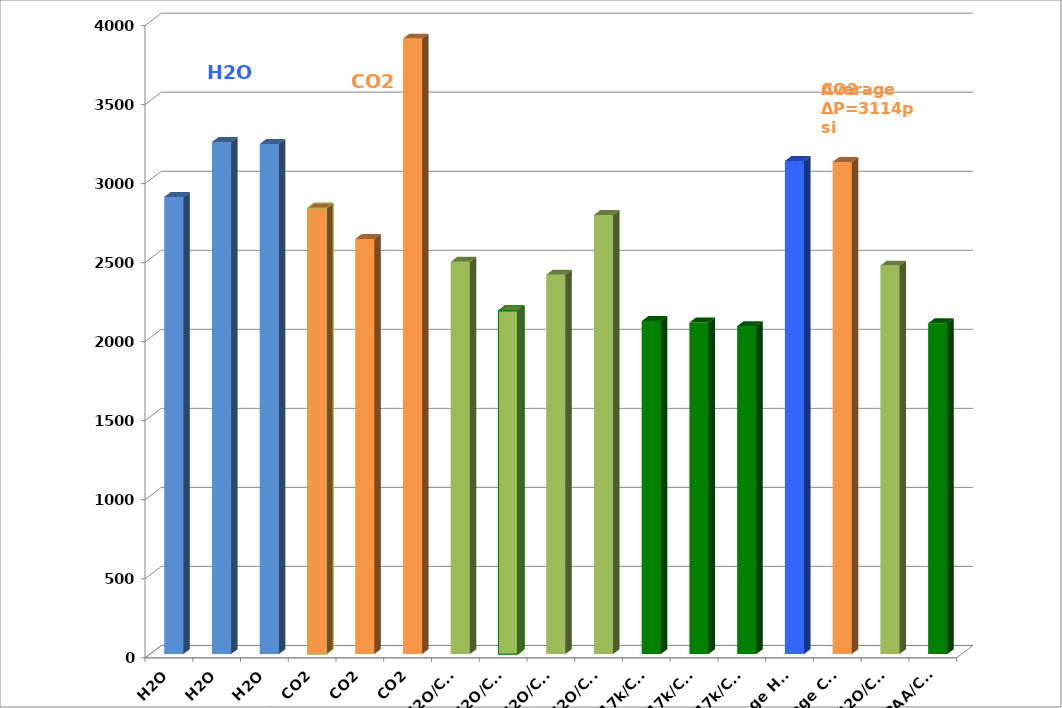
| Category | Series 0 |
|---|---|
| H2O | 2892 |
| H2O | 3240 |
| H2O | 3227 |
| CO2 | 2822 |
| CO2 | 2626 |
| CO2 | 3894 |
| DI H2O/CO2 | 2482 |
| DI H2O/CO2 | 2172 |
| DI H2O/CO2 | 2400 |
| DI H2O/CO2 | 2778 |
| PAA 1% 17k/CO2 | 2107 |
| PAA 1% 17k/CO2 | 2098 |
| PAA 1% 17k/CO2 | 2075 |
| Average H2O | 3119.667 |
| Average CO2 | 3114 |
| Average H2O/CO2 | 2458 |
| Average PAA/CO2 | 2093.333 |